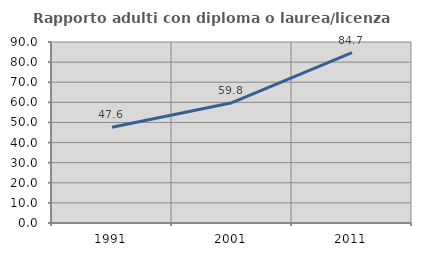
| Category | Rapporto adulti con diploma o laurea/licenza media  |
|---|---|
| 1991.0 | 47.599 |
| 2001.0 | 59.803 |
| 2011.0 | 84.688 |